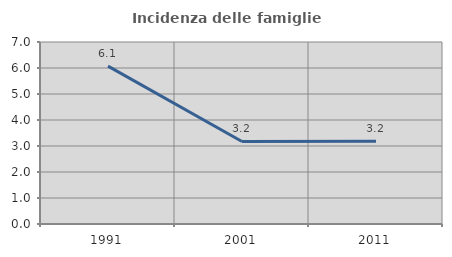
| Category | Incidenza delle famiglie numerose |
|---|---|
| 1991.0 | 6.072 |
| 2001.0 | 3.175 |
| 2011.0 | 3.18 |